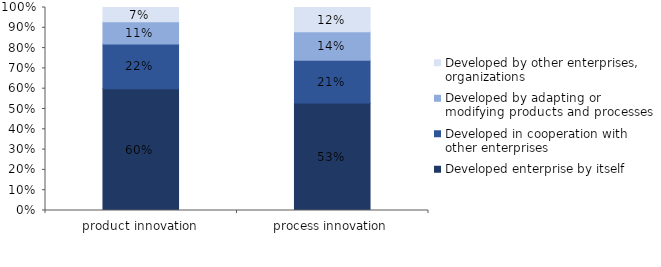
| Category | Developed enterprise by itself  | Developed in cooperation with other enterprises | Developed by adapting or modifying products and processes | Developed by other enterprises, organizations |
|---|---|---|---|---|
| product innovation | 0.6 | 0.22 | 0.11 | 0.07 |
| process innovation | 0.53 | 0.21 | 0.14 | 0.12 |